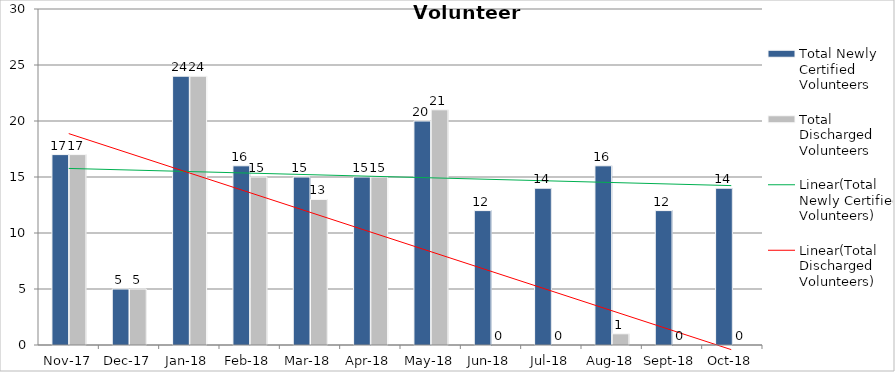
| Category | Total Newly Certified Volunteers | Total Discharged Volunteers |
|---|---|---|
| 2017-11-01 | 17 | 17 |
| 2017-12-01 | 5 | 5 |
| 2018-01-01 | 24 | 24 |
| 2018-02-01 | 16 | 15 |
| 2018-03-01 | 15 | 13 |
| 2018-04-01 | 15 | 15 |
| 2018-05-01 | 20 | 21 |
| 2018-06-01 | 12 | 0 |
| 2018-07-01 | 14 | 0 |
| 2018-08-01 | 16 | 1 |
| 2018-09-01 | 12 | 0 |
| 2018-10-01 | 14 | 0 |